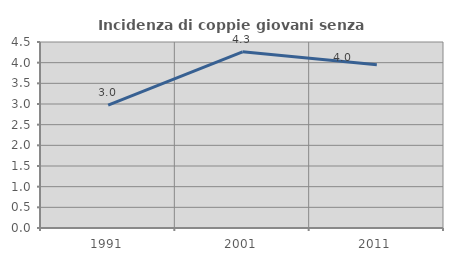
| Category | Incidenza di coppie giovani senza figli |
|---|---|
| 1991.0 | 2.975 |
| 2001.0 | 4.262 |
| 2011.0 | 3.951 |